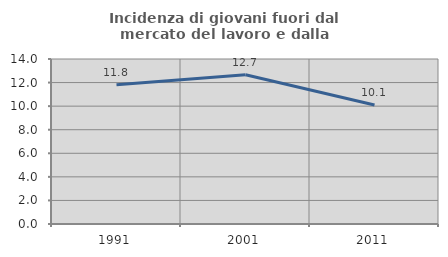
| Category | Incidenza di giovani fuori dal mercato del lavoro e dalla formazione  |
|---|---|
| 1991.0 | 11.818 |
| 2001.0 | 12.67 |
| 2011.0 | 10.092 |